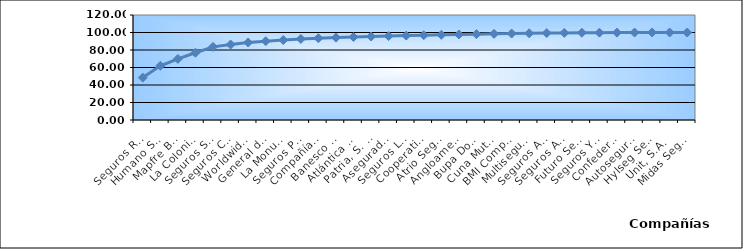
| Category | Series 0 |
|---|---|
| Seguros Reservas, S. A. | 48.494 |
| Humano Seguros, S. A. | 61.978 |
| Mapfre BHD Compañía de Seguros | 69.809 |
| La Colonial, S. A., Compañia De Seguros | 76.882 |
| Seguros Sura, S.A. | 83.578 |
| Seguros Crecer, S. A. | 86.251 |
| Worldwide Seguros, S. A. | 88.565 |
| General de Seguros, S. A. | 90.074 |
| La Monumental de Seguros, S. A. | 91.363 |
| Seguros Pepín, S. A. | 92.634 |
| Compañía Dominicana de Seguros, C. por A. | 93.447 |
| Banesco Seguros | 94.155 |
| Atlántica Seguros, S. A. | 94.81 |
| Patria, S. A., Compañía de Seguros | 95.445 |
| Aseguradora Agropecuaria Dominicana, S. A. | 95.959 |
| Seguros La Internacional, S. A. | 96.467 |
| Cooperativa Nacional De Seguros, Inc  | 96.941 |
| Atrio Seguros S. A. | 97.378 |
| Angloamericana de Seguros, S. A. | 97.763 |
| Bupa Dominicana, S. A. | 98.113 |
| Cuna Mutual Insurance Society Dominicana | 98.455 |
| BMI Compañía de Seguros, S. A. | 98.788 |
| Multiseguros Su, S.A. | 99.088 |
| Seguros APS, S.R.L. | 99.347 |
| Seguros Ademi, S.A. | 99.534 |
| Futuro Seguros | 99.719 |
| Seguros Yunen, S.A. | 99.821 |
| Confederación del Canadá Dominicana, S. A. | 99.905 |
| Autoseguro, S. A. | 99.961 |
| Hylseg Seguros S.A | 99.985 |
| Unit, S.A. | 100 |
| Midas Seguros, S.A. | 100 |